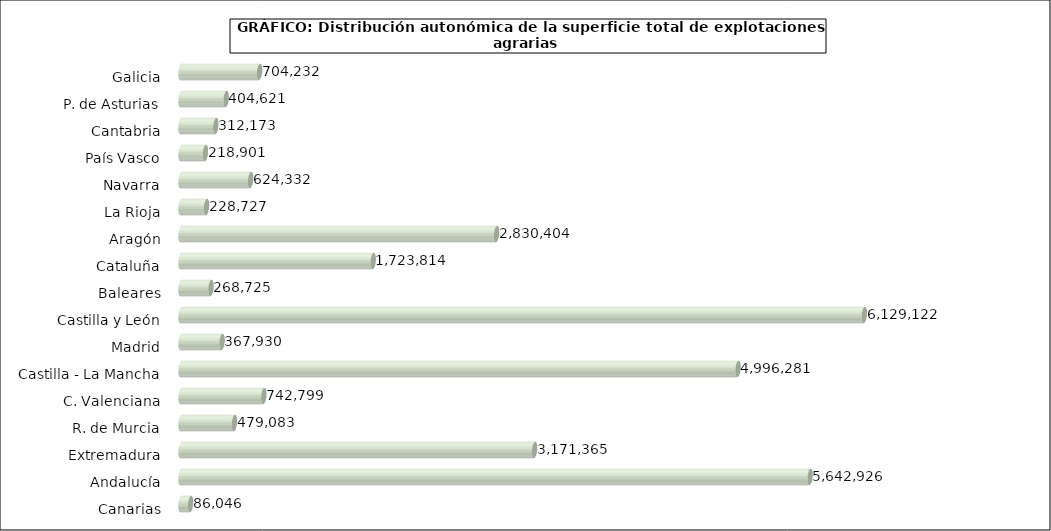
| Category | superficie |
|---|---|
|   Galicia | 704232 |
|   P. de Asturias | 404621 |
|   Cantabria | 312173 |
|   País Vasco | 218901 |
|   Navarra | 624332 |
|   La Rioja | 228727 |
|   Aragón | 2830404 |
|   Cataluña | 1723814 |
|   Baleares | 268725 |
|   Castilla y León | 6129122 |
|   Madrid | 367930 |
|   Castilla - La Mancha | 4996281 |
|   C. Valenciana | 742799 |
|   R. de Murcia | 479083 |
|   Extremadura | 3171365 |
|   Andalucía | 5642926 |
|   Canarias | 86046 |